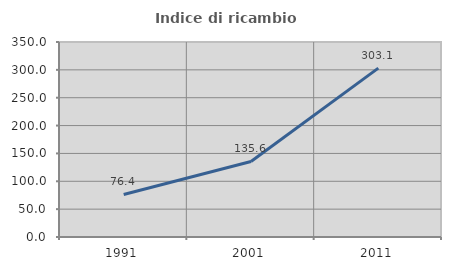
| Category | Indice di ricambio occupazionale  |
|---|---|
| 1991.0 | 76.419 |
| 2001.0 | 135.603 |
| 2011.0 | 303.077 |